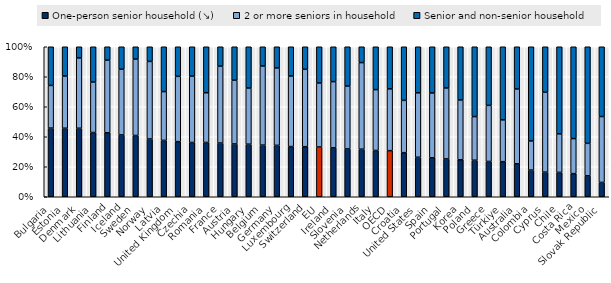
| Category | One-person senior household (↘) | 2 or more seniors in household | Senior and non-senior household |
|---|---|---|---|
| Bulgaria | 0.458 | 0.284 | 0.258 |
| Estonia | 0.457 | 0.348 | 0.195 |
| Denmark | 0.457 | 0.469 | 0.074 |
| Lithuania | 0.428 | 0.336 | 0.235 |
| Finland | 0.427 | 0.484 | 0.089 |
| Iceland | 0.412 | 0.438 | 0.15 |
| Sweden | 0.409 | 0.509 | 0.082 |
| Norway | 0.385 | 0.517 | 0.098 |
| Latvia | 0.376 | 0.325 | 0.299 |
| United Kingdom | 0.367 | 0.435 | 0.197 |
| Czechia | 0.362 | 0.442 | 0.196 |
| Romania | 0.362 | 0.332 | 0.307 |
| France | 0.358 | 0.513 | 0.129 |
| Austria | 0.352 | 0.425 | 0.223 |
| Hungary | 0.35 | 0.374 | 0.275 |
| Belgium | 0.344 | 0.527 | 0.128 |
| Germany | 0.343 | 0.516 | 0.141 |
| Luxembourg | 0.335 | 0.47 | 0.195 |
| Switzerland | 0.334 | 0.516 | 0.15 |
| EU | 0.332 | 0.426 | 0.242 |
| Ireland | 0.326 | 0.441 | 0.233 |
| Slovenia | 0.319 | 0.419 | 0.262 |
| Netherlands | 0.317 | 0.577 | 0.106 |
| Italy | 0.308 | 0.406 | 0.286 |
| OECD | 0.307 | 0.412 | 0.281 |
| Croatia | 0.294 | 0.349 | 0.357 |
| United States | 0.264 | 0.429 | 0.307 |
| Spain | 0.26 | 0.432 | 0.308 |
| Portugal | 0.252 | 0.473 | 0.275 |
| Korea | 0.247 | 0.399 | 0.355 |
| Poland | 0.244 | 0.291 | 0.466 |
| Greece | 0.235 | 0.374 | 0.391 |
| Türkiye | 0.234 | 0.279 | 0.487 |
| Australia | 0.22 | 0.499 | 0.281 |
| Colombia | 0.178 | 0.194 | 0.628 |
| Cyprus | 0.164 | 0.532 | 0.303 |
| Chile | 0.162 | 0.257 | 0.581 |
| Costa Rica | 0.154 | 0.234 | 0.612 |
| Mexico | 0.139 | 0.217 | 0.644 |
| Slovak Republic | 0.096 | 0.439 | 0.465 |